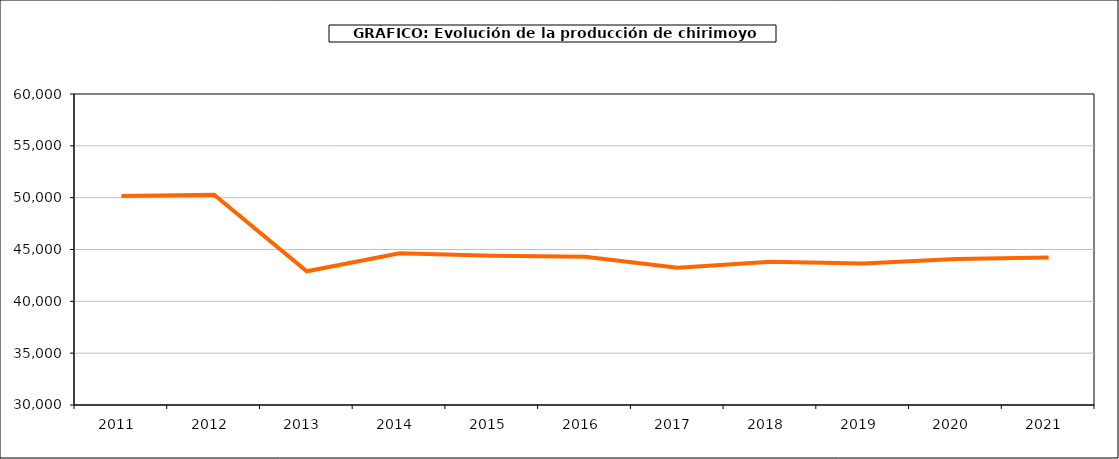
| Category | producción chirimoyo |
|---|---|
| 2011.0 | 50150 |
| 2012.0 | 50285 |
| 2013.0 | 42898 |
| 2014.0 | 44629 |
| 2015.0 | 44389 |
| 2016.0 | 44305 |
| 2017.0 | 43251 |
| 2018.0 | 43823 |
| 2019.0 | 43645 |
| 2020.0 | 44081 |
| 2021.0 | 44231 |